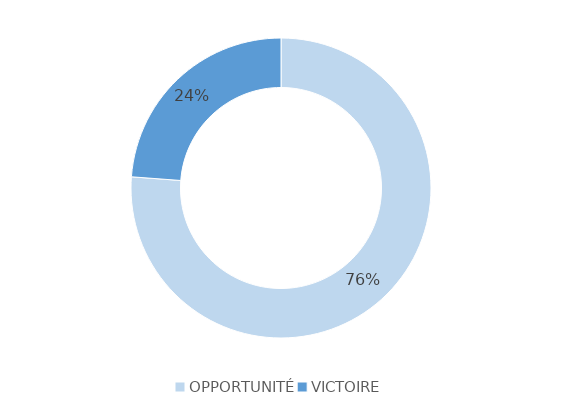
| Category | Series 0 |
|---|---|
| OPPORTUNITÉ | 16 |
| VICTOIRE | 5 |